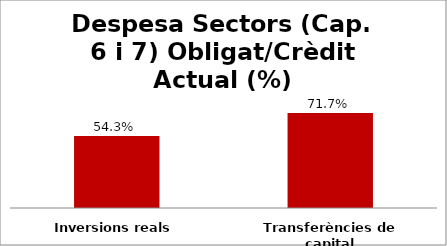
| Category | Series 0 |
|---|---|
| Inversions reals | 0.543 |
| Transferències de capital | 0.717 |